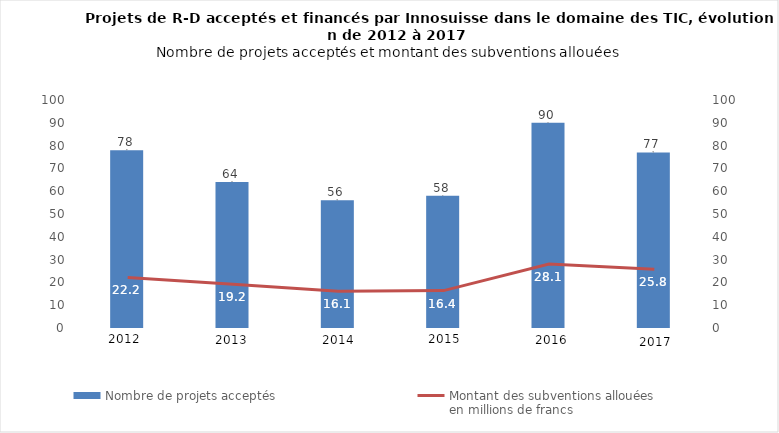
| Category | Nombre de projets acceptés  |
|---|---|
| 2012.0 | 78 |
| 2013.0 | 64 |
| 2014.0 | 56 |
| 2015.0 | 58 |
| 2016.0 | 90 |
| 2017.0 | 77 |